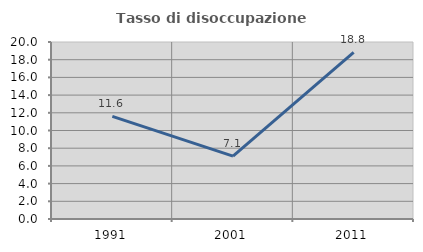
| Category | Tasso di disoccupazione giovanile  |
|---|---|
| 1991.0 | 11.596 |
| 2001.0 | 7.109 |
| 2011.0 | 18.819 |